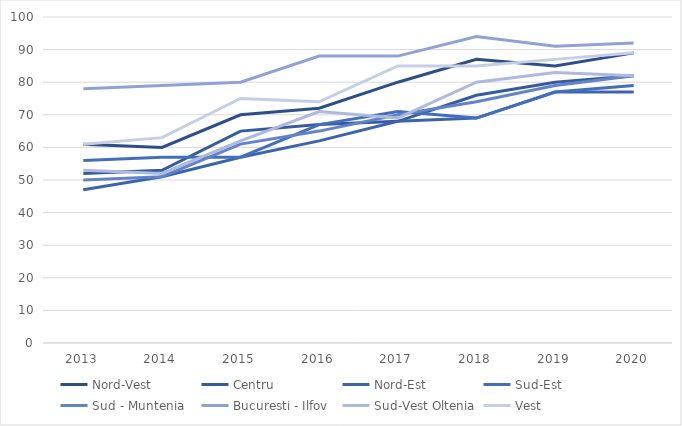
| Category | Nord-Vest | Centru | Nord-Est | Sud-Est | Sud - Muntenia | Bucuresti - Ilfov | Sud-Vest Oltenia | Vest |
|---|---|---|---|---|---|---|---|---|
| 2013 | 61 | 52 | 47 | 56 | 50 | 78 | 53 | 61 |
| 2014 | 60 | 53 | 51 | 57 | 51 | 79 | 52 | 63 |
| 2015 | 70 | 65 | 57 | 57 | 61 | 80 | 62 | 75 |
| 2016 | 72 | 67 | 62 | 67 | 65 | 88 | 71 | 74 |
| 2017 | 80 | 68 | 68 | 71 | 70 | 88 | 69 | 85 |
| 2018 | 87 | 76 | 69 | 69 | 74 | 94 | 80 | 85 |
| 2019 | 85 | 80 | 77 | 77 | 79 | 91 | 83 | 87 |
| 2020 | 89 | 82 | 77 | 79 | 82 | 92 | 82 | 89 |